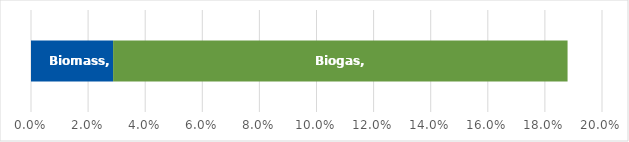
| Category | Biomass | Biogas |
|---|---|---|
| 0 | 0.029 | 0.159 |